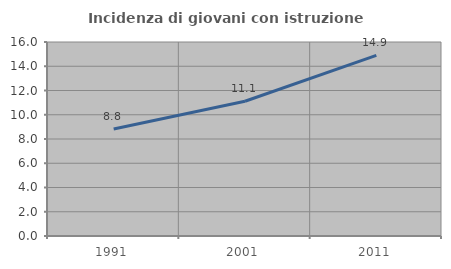
| Category | Incidenza di giovani con istruzione universitaria |
|---|---|
| 1991.0 | 8.824 |
| 2001.0 | 11.111 |
| 2011.0 | 14.894 |